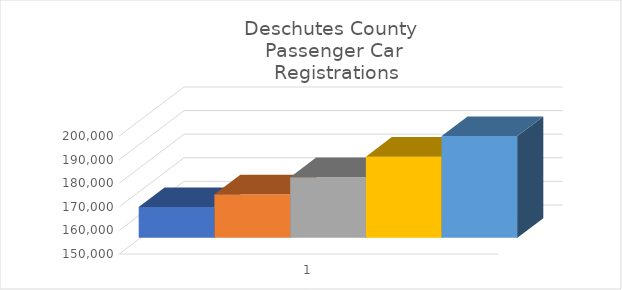
| Category | Series 0 | Series 1 | Series 2 | Series 3 | Series 4 |
|---|---|---|---|---|---|
| 0 | 163026 | 168419 | 175689 | 184375 | 193105 |